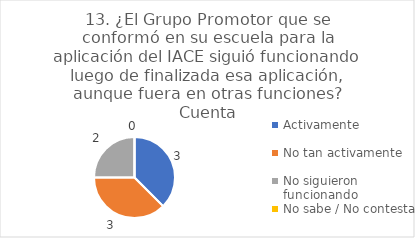
| Category | 13. ¿El Grupo Promotor que se conformó en su escuela para la aplicación del IACE siguió funcionando luego de finalizada esa aplicación, aunque fuera en otras funciones? |
|---|---|
| Activamente  | 0.375 |
| No tan activamente  | 0.375 |
| No siguieron funcionando  | 0.25 |
| No sabe / No contesta | 0 |